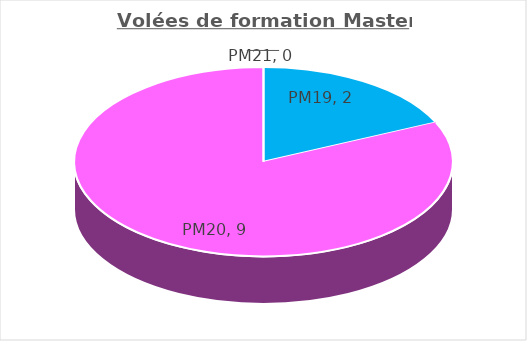
| Category | Series 0 |
|---|---|
| PM19 | 2 |
| PM20 | 9 |
| PM21 | 0 |